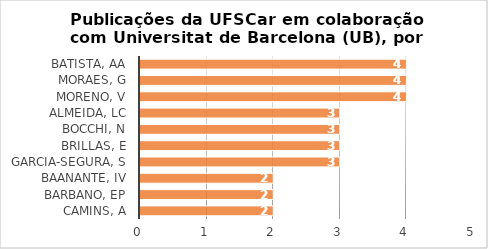
| Category | # Records |
|---|---|
| BATISTA, AA | 4 |
| MORAES, G | 4 |
| MORENO, V | 4 |
| ALMEIDA, LC | 3 |
| BOCCHI, N | 3 |
| BRILLAS, E | 3 |
| GARCIA-SEGURA, S | 3 |
| BAANANTE, IV | 2 |
| BARBANO, EP | 2 |
| CAMINS, A | 2 |